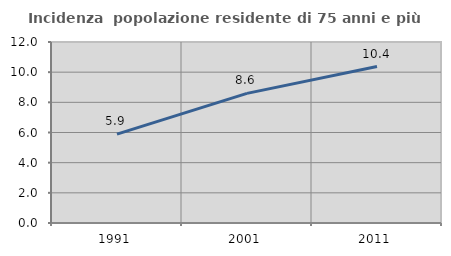
| Category | Incidenza  popolazione residente di 75 anni e più |
|---|---|
| 1991.0 | 5.89 |
| 2001.0 | 8.596 |
| 2011.0 | 10.375 |